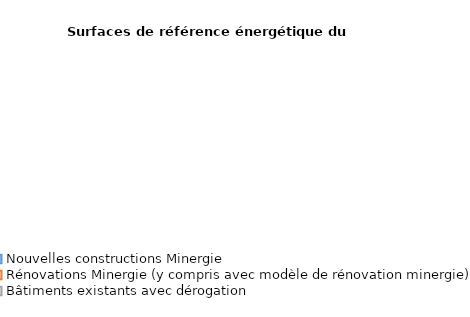
| Category | Series 0 |
|---|---|
| Nouvelles constructions Minergie | 0 |
| Rénovations Minergie (y compris avec modèle de rénovation minergie) | 0 |
| Bâtiments existants avec dérogation | 0 |